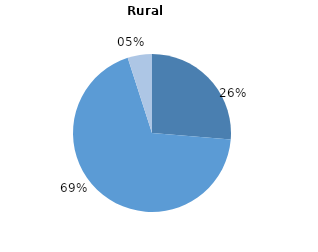
| Category | Series 0 |
|---|---|
| 0 | 26.309 |
| 1 | 68.714 |
| 2 | 4.977 |